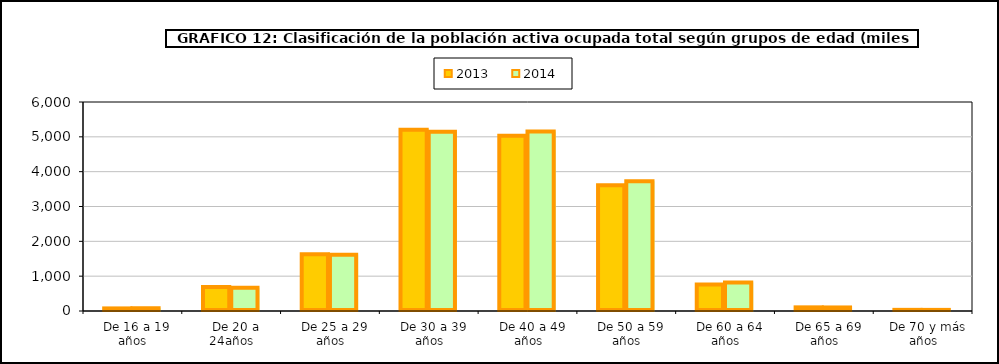
| Category | 2013 | 2014 |
|---|---|---|
|   De 16 a 19 años | 74.4 | 79.4 |
|   De 20 a 24años | 689 | 669.2 |
|   De 25 a 29 años | 1628 | 1616.8 |
|   De 30 a 39 años | 5206.2 | 5147.6 |
|   De 40 a 49 años | 5031.1 | 5152.2 |
|   De 50 a 59 años | 3611.9 | 3724.5 |
|   De 60 a 64 años | 761 | 820.9 |
|   De 65 a 69 años | 104.6 | 101.8 |
|   De 70 y más años | 32.9 | 31.9 |